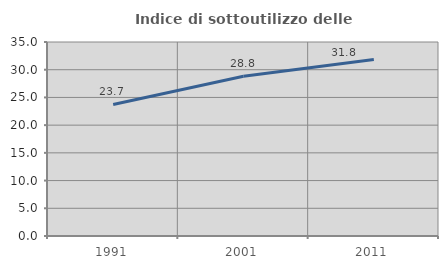
| Category | Indice di sottoutilizzo delle abitazioni  |
|---|---|
| 1991.0 | 23.729 |
| 2001.0 | 28.837 |
| 2011.0 | 31.846 |